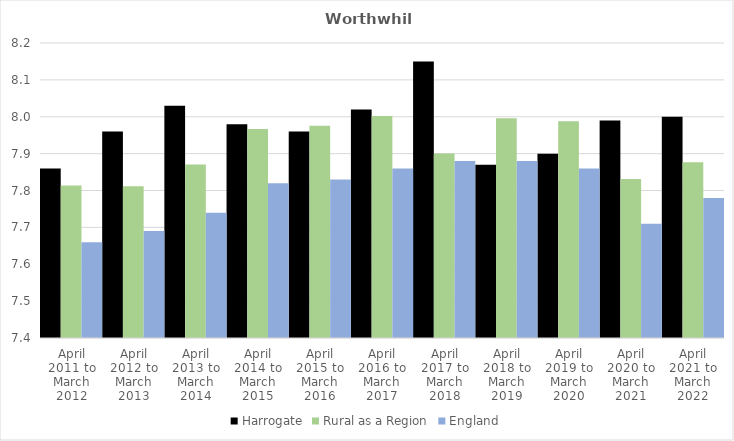
| Category | Harrogate | Rural as a Region | England |
|---|---|---|---|
| April 2011 to March 2012 | 7.86 | 7.813 | 7.66 |
| April 2012 to March 2013 | 7.96 | 7.811 | 7.69 |
| April 2013 to March 2014 | 8.03 | 7.871 | 7.74 |
| April 2014 to March 2015 | 7.98 | 7.967 | 7.82 |
| April 2015 to March 2016 | 7.96 | 7.975 | 7.83 |
| April 2016 to March 2017 | 8.02 | 8.002 | 7.86 |
| April 2017 to March 2018 | 8.15 | 7.9 | 7.88 |
| April 2018 to March 2019 | 7.87 | 7.996 | 7.88 |
| April 2019 to March 2020 | 7.9 | 7.988 | 7.86 |
| April 2020 to March 2021 | 7.99 | 7.831 | 7.71 |
| April 2021 to March 2022 | 8 | 7.877 | 7.78 |